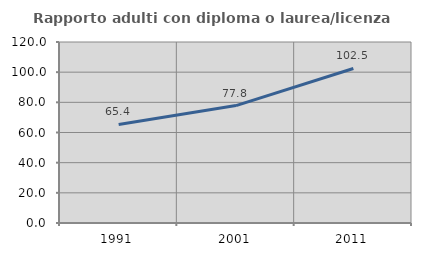
| Category | Rapporto adulti con diploma o laurea/licenza media  |
|---|---|
| 1991.0 | 65.359 |
| 2001.0 | 77.835 |
| 2011.0 | 102.451 |